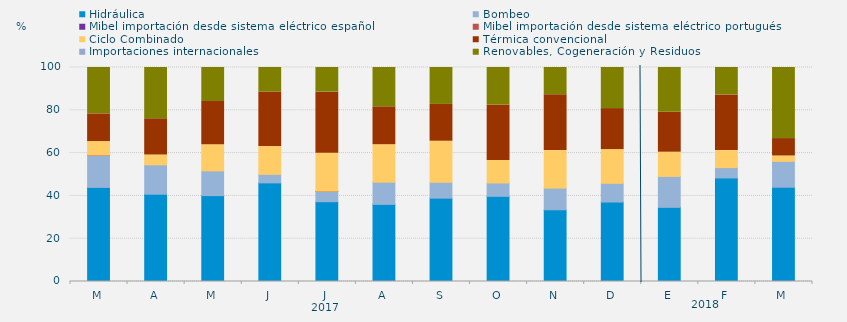
| Category | Hidráulica | Bombeo | Mibel importación desde sistema eléctrico español | Mibel importación desde sistema eléctrico portugués | Ciclo Combinado | Térmica convencional | Importaciones internacionales | Renovables, Cogeneración y Residuos |
|---|---|---|---|---|---|---|---|---|
| M | 43.966 | 14.984 | 0 | 0.135 | 6.303 | 12.943 | 0 | 21.669 |
| A | 40.799 | 13.738 | 0 | 0 | 4.583 | 16.933 | 0 | 23.947 |
| M | 40.143 | 11.559 | 0 | 0 | 12.186 | 20.228 | 0 | 15.883 |
| J | 46.088 | 3.981 | 0 | 0 | 13.032 | 25.463 | 0 | 11.435 |
| J | 37.298 | 4.783 | 0 | 0.134 | 17.675 | 28.595 | 0 | 11.514 |
| A | 36.044 | 10.361 | 0 | 0 | 17.518 | 17.708 | 0 | 18.369 |
| S | 38.947 | 7.407 | 0 | 0 | 19.201 | 17.187 | 0 | 17.257 |
| O | 39.807 | 6.25 | 0 | 0 | 10.484 | 25.963 | 0 | 17.496 |
| N | 33.519 | 10.116 | 0 | 0 | 17.546 | 26.088 | 0 | 12.731 |
| D | 37.142 | 8.737 | 0 | 0 | 15.771 | 19.153 | 0 | 19.198 |
| E | 34.655 | 14.449 | 0 | 0 | 11.313 | 18.638 | 0 | 20.945 |
| F | 48.388 | 4.836 | 0 | 0 | 7.961 | 25.992 | 0 | 12.822 |
| M | 44.056 | 12.113 | 0 | 0 | 2.49 | 8.12 | 0 | 33.221 |